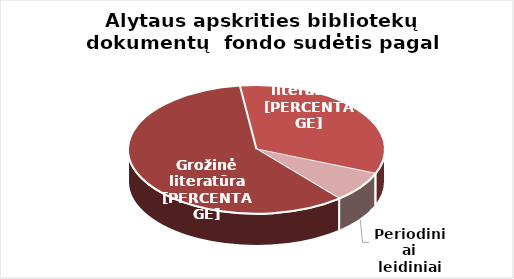
| Category | Series 0 |
|---|---|
| Grožinė literatūra* | 628844 |
| Šakinė literatūra* | 354454 |
| Periodiniai leidiniai | 81809 |